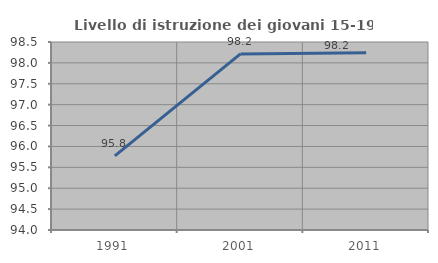
| Category | Livello di istruzione dei giovani 15-19 anni |
|---|---|
| 1991.0 | 95.775 |
| 2001.0 | 98.214 |
| 2011.0 | 98.246 |